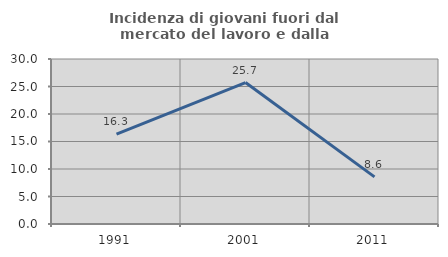
| Category | Incidenza di giovani fuori dal mercato del lavoro e dalla formazione  |
|---|---|
| 1991.0 | 16.327 |
| 2001.0 | 25.714 |
| 2011.0 | 8.571 |